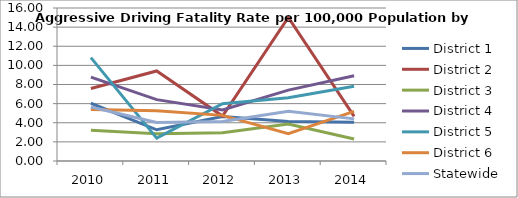
| Category | District 1 | District 2 | District 3 | District 4 | District 5 | District 6 | Statewide |
|---|---|---|---|---|---|---|---|
| 2010.0 | 6.041 | 7.589 | 3.208 | 8.774 | 10.808 | 5.379 | 5.642 |
| 2011.0 | 3.262 | 9.415 | 2.855 | 6.417 | 2.391 | 5.256 | 4.038 |
| 2012.0 | 4.641 | 4.695 | 2.956 | 5.343 | 5.997 | 4.773 | 4.136 |
| 2013.0 | 4.137 | 15.011 | 3.876 | 7.413 | 6.621 | 2.85 | 5.21 |
| 2014.0 | 4.065 | 4.671 | 2.306 | 8.924 | 7.82 | 5.183 | 4.405 |